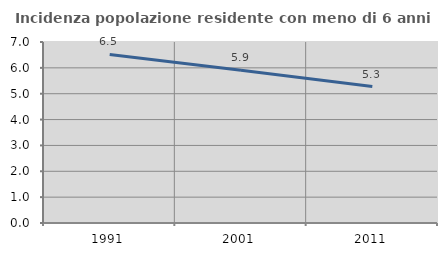
| Category | Incidenza popolazione residente con meno di 6 anni |
|---|---|
| 1991.0 | 6.518 |
| 2001.0 | 5.907 |
| 2011.0 | 5.278 |